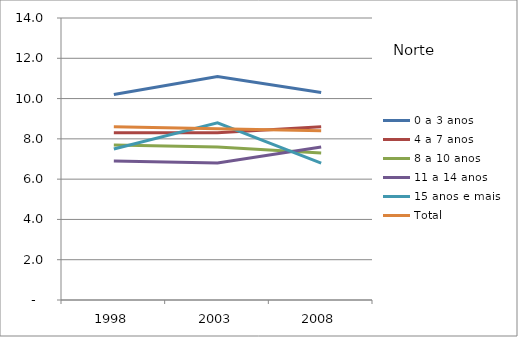
| Category | 0 a 3 anos | 4 a 7 anos | 8 a 10 anos | 11 a 14 anos | 15 anos e mais | Total |
|---|---|---|---|---|---|---|
| 1998.0 | 10.2 | 8.3 | 7.7 | 6.9 | 7.5 | 8.6 |
| 2003.0 | 11.1 | 8.3 | 7.6 | 6.8 | 8.8 | 8.5 |
| 2008.0 | 10.3 | 8.6 | 7.3 | 7.6 | 6.8 | 8.4 |